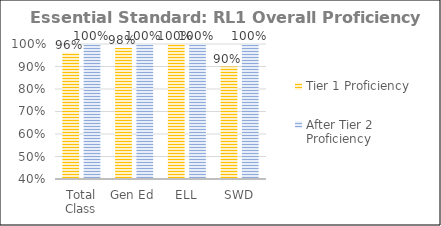
| Category | Tier 1 Proficiency | After Tier 2 Proficiency |
|---|---|---|
| Total Class | 0.961 | 1 |
| Gen Ed | 0.982 | 1 |
| ELL | 1 | 1 |
| SWD | 0.9 | 1 |